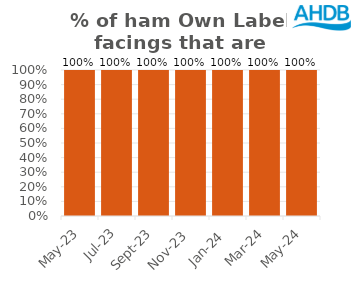
| Category | Ham |
|---|---|
| 2023-05-01 | 1 |
| 2023-07-01 | 1 |
| 2023-09-01 | 1 |
| 2023-11-01 | 1 |
| 2024-01-01 | 1 |
| 2024-03-01 | 1 |
| 2024-05-01 | 1 |